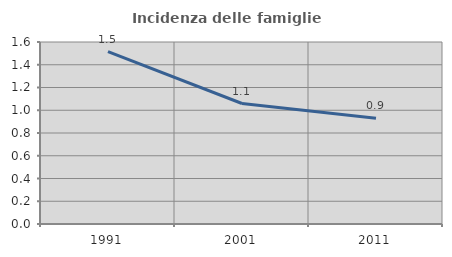
| Category | Incidenza delle famiglie numerose |
|---|---|
| 1991.0 | 1.515 |
| 2001.0 | 1.059 |
| 2011.0 | 0.929 |